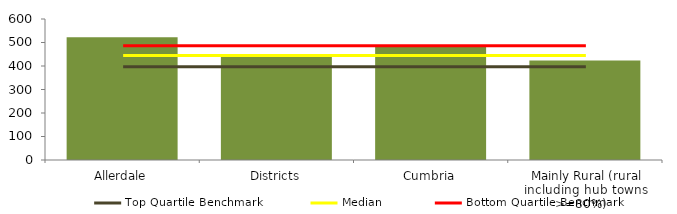
| Category | Block Data |
|---|---|
| Allerdale | 522.2 |
| Districts | 440.778 |
| Cumbria | 484.8 |
|  Mainly Rural (rural including hub towns >=80%)   | 423.086 |